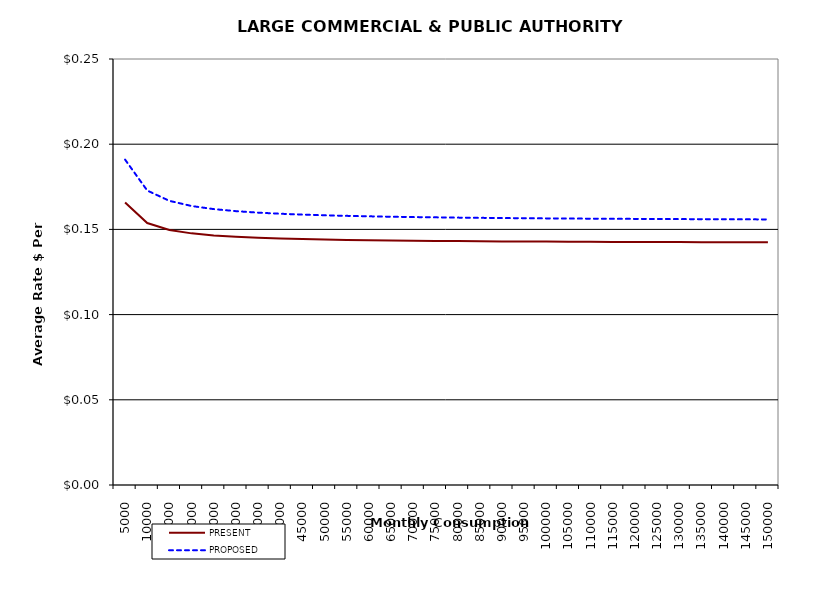
| Category | PRESENT | PROPOSED |
|---|---|---|
| 5000.0 | 0.166 | 0.191 |
| 10000.0 | 0.154 | 0.173 |
| 15000.0 | 0.15 | 0.167 |
| 20000.0 | 0.148 | 0.164 |
| 25000.0 | 0.146 | 0.162 |
| 30000.0 | 0.146 | 0.161 |
| 35000.0 | 0.145 | 0.16 |
| 40000.0 | 0.145 | 0.159 |
| 45000.0 | 0.144 | 0.159 |
| 50000.0 | 0.144 | 0.158 |
| 55000.0 | 0.144 | 0.158 |
| 60000.0 | 0.144 | 0.158 |
| 65000.0 | 0.143 | 0.157 |
| 70000.0 | 0.143 | 0.157 |
| 75000.0 | 0.143 | 0.157 |
| 80000.0 | 0.143 | 0.157 |
| 85000.0 | 0.143 | 0.157 |
| 90000.0 | 0.143 | 0.157 |
| 95000.0 | 0.143 | 0.157 |
| 100000.0 | 0.143 | 0.156 |
| 105000.0 | 0.143 | 0.156 |
| 110000.0 | 0.143 | 0.156 |
| 115000.0 | 0.143 | 0.156 |
| 120000.0 | 0.143 | 0.156 |
| 125000.0 | 0.143 | 0.156 |
| 130000.0 | 0.143 | 0.156 |
| 135000.0 | 0.143 | 0.156 |
| 140000.0 | 0.142 | 0.156 |
| 145000.0 | 0.142 | 0.156 |
| 150000.0 | 0.142 | 0.156 |